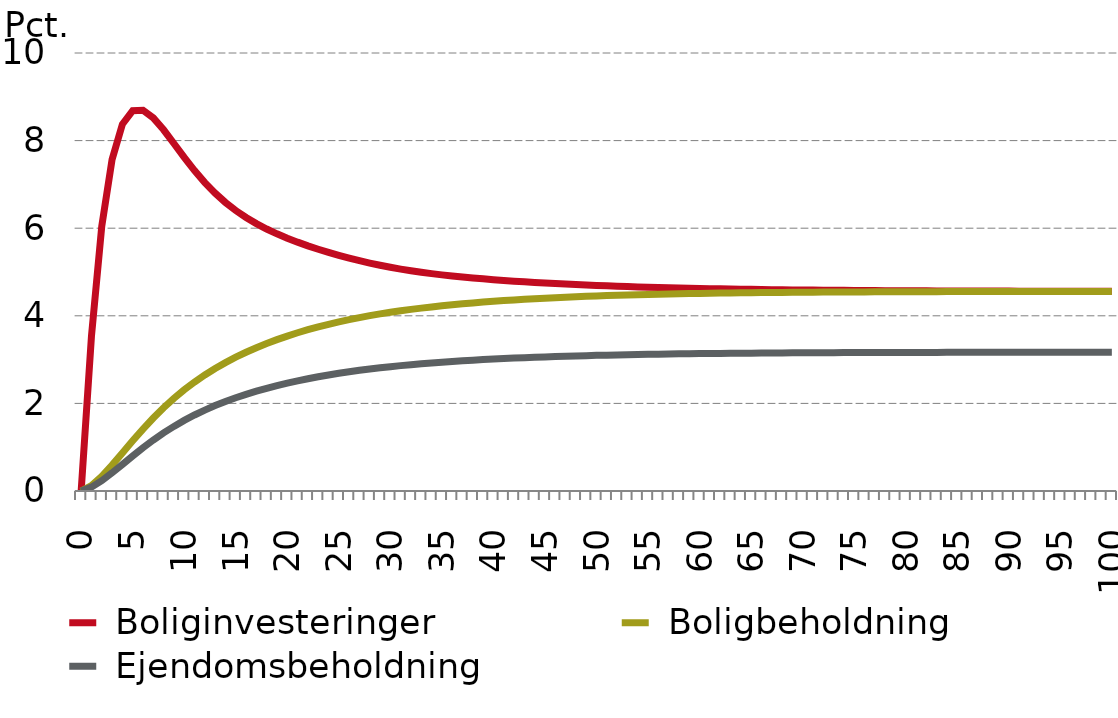
| Category |  Boliginvesteringer |  Boligbeholdning |  Ejendomsbeholdning |
|---|---|---|---|
| 0.0 | 0 | 0 | 0 |
| nan | 3.534 | 0.126 | 0.088 |
| nan | 6.044 | 0.336 | 0.235 |
| nan | 7.569 | 0.592 | 0.414 |
| nan | 8.373 | 0.868 | 0.607 |
| 5.0 | 8.684 | 1.145 | 0.8 |
| nan | 8.693 | 1.413 | 0.987 |
| nan | 8.519 | 1.666 | 1.163 |
| nan | 8.247 | 1.9 | 1.326 |
| nan | 7.934 | 2.114 | 1.475 |
| 10.0 | 7.616 | 2.31 | 1.612 |
| nan | 7.315 | 2.488 | 1.735 |
| nan | 7.042 | 2.65 | 1.848 |
| nan | 6.799 | 2.797 | 1.95 |
| nan | 6.587 | 2.932 | 2.043 |
| 15.0 | 6.404 | 3.055 | 2.129 |
| nan | 6.244 | 3.168 | 2.207 |
| nan | 6.104 | 3.272 | 2.279 |
| nan | 5.981 | 3.367 | 2.345 |
| nan | 5.872 | 3.456 | 2.407 |
| 20.0 | 5.772 | 3.537 | 2.463 |
| nan | 5.681 | 3.613 | 2.515 |
| nan | 5.597 | 3.682 | 2.564 |
| nan | 5.519 | 3.747 | 2.608 |
| nan | 5.447 | 3.807 | 2.65 |
| 25.0 | 5.379 | 3.862 | 2.688 |
| nan | 5.316 | 3.912 | 2.723 |
| nan | 5.257 | 3.959 | 2.755 |
| nan | 5.203 | 4.003 | 2.785 |
| nan | 5.154 | 4.043 | 2.813 |
| 30.0 | 5.108 | 4.08 | 2.839 |
| nan | 5.067 | 4.114 | 2.863 |
| nan | 5.029 | 4.146 | 2.885 |
| nan | 4.994 | 4.176 | 2.905 |
| nan | 4.963 | 4.203 | 2.924 |
| 35.0 | 4.935 | 4.228 | 2.941 |
| nan | 4.909 | 4.252 | 2.958 |
| nan | 4.885 | 4.274 | 2.973 |
| nan | 4.863 | 4.294 | 2.987 |
| nan | 4.843 | 4.313 | 3 |
| 40.0 | 4.825 | 4.331 | 3.012 |
| nan | 4.808 | 4.348 | 3.024 |
| nan | 4.791 | 4.363 | 3.034 |
| nan | 4.776 | 4.377 | 3.044 |
| nan | 4.762 | 4.391 | 3.053 |
| 45.0 | 4.749 | 4.403 | 3.062 |
| nan | 4.736 | 4.414 | 3.07 |
| nan | 4.724 | 4.425 | 3.077 |
| nan | 4.713 | 4.435 | 3.084 |
| nan | 4.703 | 4.444 | 3.091 |
| 50.0 | 4.693 | 4.453 | 3.097 |
| nan | 4.684 | 4.461 | 3.102 |
| nan | 4.675 | 4.468 | 3.107 |
| nan | 4.667 | 4.475 | 3.112 |
| nan | 4.66 | 4.481 | 3.116 |
| 55.0 | 4.653 | 4.487 | 3.12 |
| nan | 4.646 | 4.493 | 3.124 |
| nan | 4.64 | 4.498 | 3.128 |
| nan | 4.634 | 4.503 | 3.131 |
| nan | 4.629 | 4.507 | 3.134 |
| 60.0 | 4.624 | 4.511 | 3.137 |
| nan | 4.619 | 4.515 | 3.139 |
| nan | 4.615 | 4.518 | 3.142 |
| nan | 4.611 | 4.521 | 3.144 |
| nan | 4.607 | 4.524 | 3.146 |
| 65.0 | 4.604 | 4.527 | 3.148 |
| nan | 4.6 | 4.529 | 3.149 |
| nan | 4.597 | 4.532 | 3.151 |
| nan | 4.594 | 4.534 | 3.153 |
| nan | 4.592 | 4.536 | 3.154 |
| 70.0 | 4.589 | 4.538 | 3.155 |
| nan | 4.587 | 4.539 | 3.156 |
| nan | 4.585 | 4.541 | 3.157 |
| nan | 4.583 | 4.542 | 3.158 |
| nan | 4.581 | 4.544 | 3.159 |
| 75.0 | 4.579 | 4.545 | 3.16 |
| nan | 4.577 | 4.546 | 3.161 |
| nan | 4.576 | 4.547 | 3.162 |
| nan | 4.574 | 4.548 | 3.162 |
| nan | 4.573 | 4.549 | 3.163 |
| 80.0 | 4.572 | 4.55 | 3.163 |
| nan | 4.571 | 4.55 | 3.164 |
| nan | 4.57 | 4.551 | 3.164 |
| nan | 4.569 | 4.552 | 3.165 |
| nan | 4.568 | 4.552 | 3.165 |
| 85.0 | 4.567 | 4.553 | 3.166 |
| nan | 4.566 | 4.553 | 3.166 |
| nan | 4.565 | 4.554 | 3.166 |
| nan | 4.565 | 4.554 | 3.166 |
| nan | 4.564 | 4.554 | 3.167 |
| 90.0 | 4.563 | 4.555 | 3.167 |
| nan | 4.563 | 4.555 | 3.167 |
| nan | 4.562 | 4.555 | 3.167 |
| nan | 4.562 | 4.555 | 3.167 |
| nan | 4.561 | 4.556 | 3.168 |
| 95.0 | 4.561 | 4.556 | 3.168 |
| nan | 4.561 | 4.556 | 3.168 |
| nan | 4.56 | 4.556 | 3.168 |
| nan | 4.56 | 4.556 | 3.168 |
| nan | 4.56 | 4.556 | 3.168 |
| 100.0 | 4.559 | 4.556 | 3.168 |